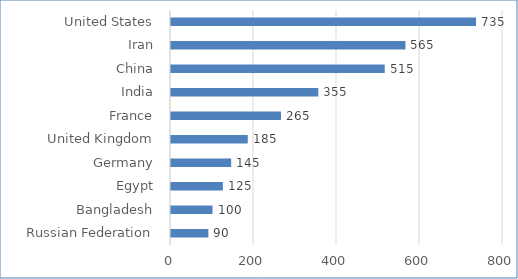
| Category | Series 0 |
|---|---|
|     Russian Federation | 90 |
|     Bangladesh | 100 |
|     Egypt | 125 |
|     Germany | 145 |
|     United Kingdom | 185 |
|     France | 265 |
|     India | 355 |
|     China | 515 |
|     Iran | 565 |
|     United States | 735 |